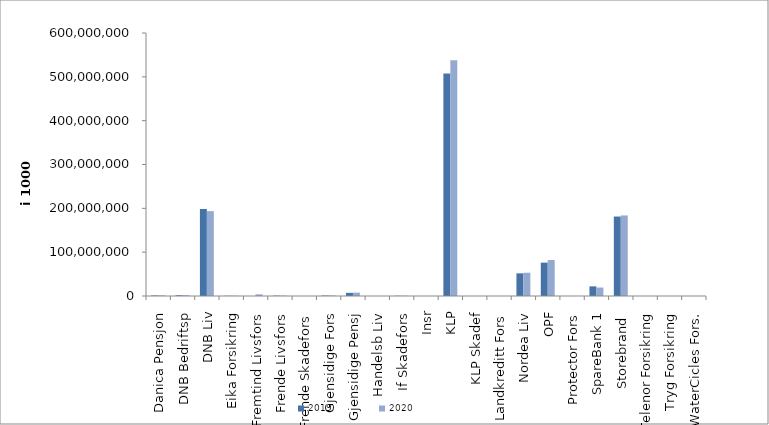
| Category | 2019 | 2020 |
|---|---|---|
| Danica Pensjon | 1179127.288 | 1320149.652 |
| DNB Bedriftsp | 1723587 | 1799572 |
| DNB Liv | 198525277 | 193584584.224 |
| Eika Forsikring | 503320 | 543598 |
| Fremtind Livsfors | 0 | 3822716.133 |
| Frende Livsfors | 848727 | 790605 |
| Frende Skadefors | 0 | 0 |
| Gjensidige Fors | 1122791 | 1127127 |
| Gjensidige Pensj | 7183029 | 7662525 |
| Handelsb Liv | 27038.082 | 22414.323 |
| If Skadefors | 512717.341 | 513146.818 |
| Insr | 6599.888 | 2056 |
| KLP | 507748922.502 | 537548840.241 |
| KLP Skadef | 40612 | 52996 |
| Landkreditt Fors | 0 | 0 |
| Nordea Liv | 51672210.116 | 53026780 |
| OPF | 76067254.041 | 82047000 |
| Protector Fors | 0 | 4585.807 |
| SpareBank 1 | 21982930.468 | 19298850.996 |
| Storebrand  | 181279490.908 | 183812146.525 |
| Telenor Forsikring | 0 | 0 |
| Tryg Forsikring | 0 | 0 |
| WaterCicles Fors. | 0 | 0 |